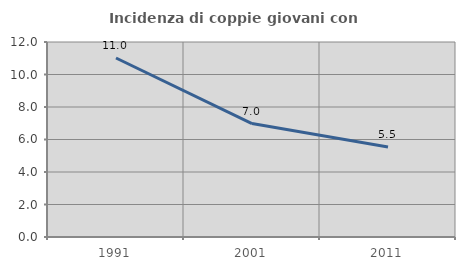
| Category | Incidenza di coppie giovani con figli |
|---|---|
| 1991.0 | 11.014 |
| 2001.0 | 6.982 |
| 2011.0 | 5.535 |